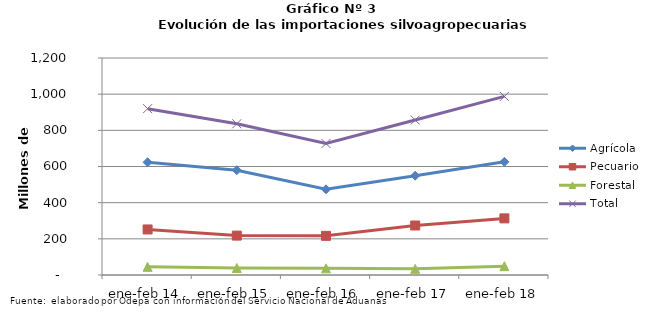
| Category | Agrícola | Pecuario | Forestal | Total |
|---|---|---|---|---|
| ene-feb 14 | 623115 | 251806 | 44966 | 919887 |
| ene-feb 15 | 579618 | 217860 | 38674 | 836152 |
| ene-feb 16 | 473936 | 216531 | 36755 | 727222 |
| ene-feb 17 | 549037 | 273737 | 34063 | 856837 |
| ene-feb 18 | 625774 | 313096 | 48837 | 987707 |